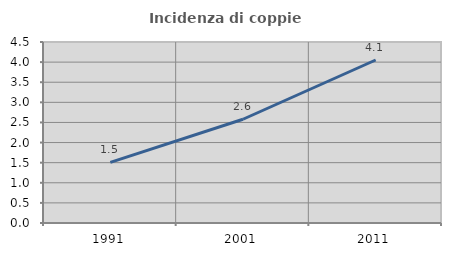
| Category | Incidenza di coppie miste |
|---|---|
| 1991.0 | 1.509 |
| 2001.0 | 2.579 |
| 2011.0 | 4.052 |